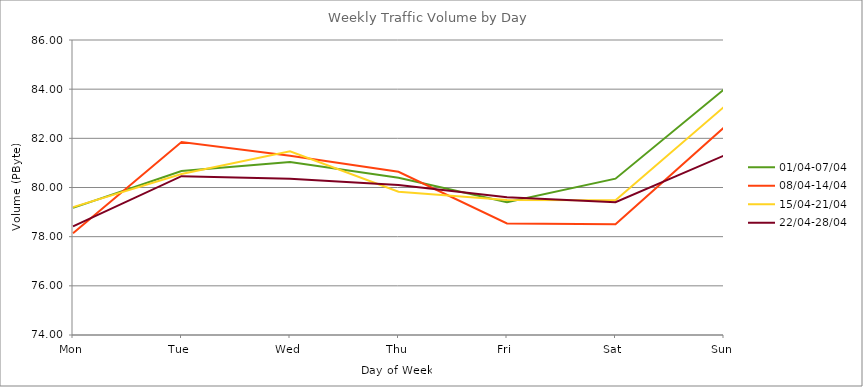
| Category | 01/04-07/04 | 08/04-14/04 | 15/04-21/04 | 22/04-28/04 |
|---|---|---|---|---|
| Mon | 79.17 | 78.14 | 79.2 | 78.42 |
| Tue | 80.67 | 81.85 | 80.55 | 80.46 |
| Wed | 81.04 | 81.29 | 81.47 | 80.36 |
| Thu | 80.4 | 80.64 | 79.83 | 80.1 |
| Fri | 79.4 | 78.54 | 79.49 | 79.6 |
| Sat | 80.36 | 78.51 | 79.48 | 79.4 |
| Sun | 83.99 | 82.44 | 83.28 | 81.3 |